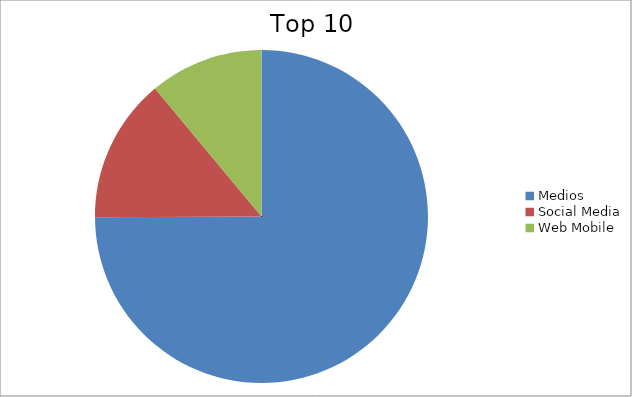
| Category | Series 0 |
|---|---|
| Medios | 74.93 |
| Social Media | 14.03 |
| Web Mobile | 11.04 |